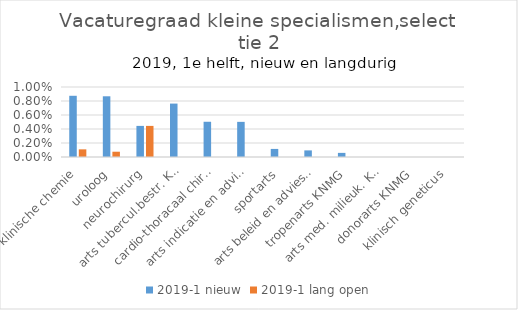
| Category | 2019-1 |
|---|---|
| arts klinische chemie | 0.001 |
| uroloog | 0.001 |
| neurochirurg | 0.004 |
| arts tubercul.bestr. KNMG | 0 |
| cardio-thoracaal chirurg | 0 |
| arts indicatie en advies KNMG | 0 |
| sportarts | 0 |
| arts beleid en advies KNMG | 0 |
| tropenarts KNMG | 0 |
| arts med. milieuk. KNMG | 0 |
| donorarts KNMG | 0 |
| klinisch geneticus | 0 |